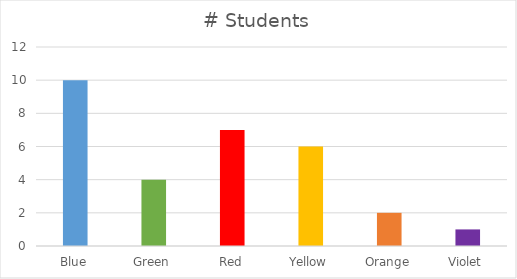
| Category | # Students |
|---|---|
| Blue | 10 |
| Green | 4 |
| Red | 7 |
| Yellow | 6 |
| Orange | 2 |
| Violet | 1 |